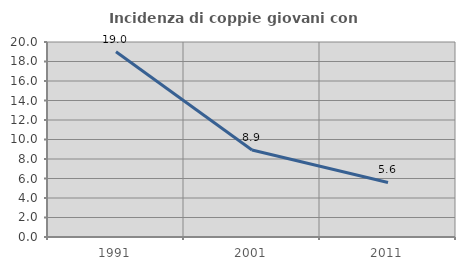
| Category | Incidenza di coppie giovani con figli |
|---|---|
| 1991.0 | 18.992 |
| 2001.0 | 8.931 |
| 2011.0 | 5.593 |